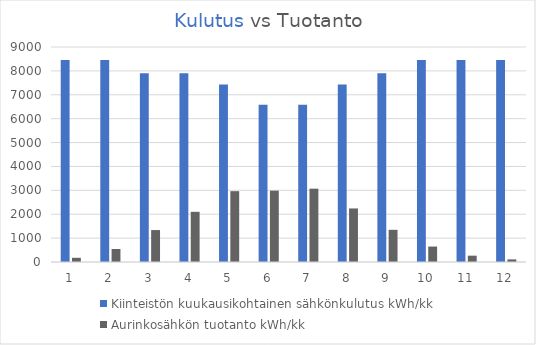
| Category | Kiinteistön kuukausikohtainen sähkönkulutus kWh/kk | Aurinkosähkön tuotanto kWh/kk |
|---|---|---|
| 0 | 8460 | 175.386 |
| 1 | 8460 | 544.544 |
| 2 | 7896 | 1337.315 |
| 3 | 7896 | 2100.384 |
| 4 | 7426 | 2965.113 |
| 5 | 6580 | 2986.152 |
| 6 | 6580 | 3069.248 |
| 7 | 7426 | 2241.647 |
| 8 | 7896 | 1347.216 |
| 9 | 8460 | 646.734 |
| 10 | 8460 | 265.2 |
| 11 | 8460 | 109.616 |